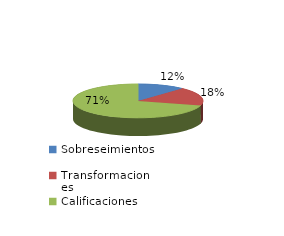
| Category | Series 0 |
|---|---|
| Sobreseimientos | 43 |
| Transformaciones | 64 |
| Calificaciones | 257 |